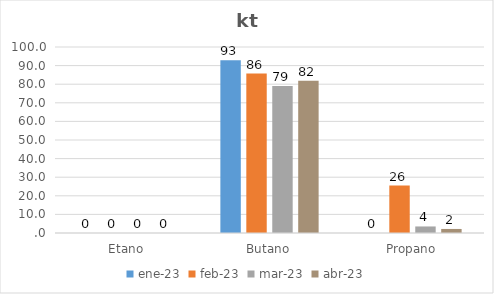
| Category | ene-23 | feb-23 | mar-23 | abr-23 |
|---|---|---|---|---|
| Etano | 0 | 0 | 0 | 0 |
| Butano | 92.911 | 85.721 | 79.081 | 81.85 |
| Propano | 0 | 25.503 | 3.517 | 2.174 |